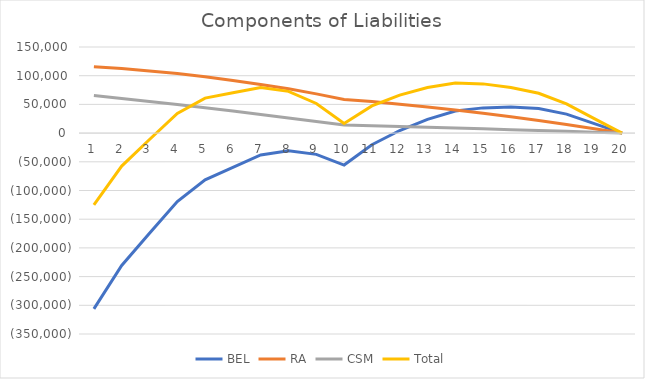
| Category | BEL | RA | CSM | Total |
|---|---|---|---|---|
| 0 | -306260.478 | 115637.247 | 65696.036 | -124927.195 |
| 1 | -230634.913 | 112665.937 | 60455.603 | -57513.374 |
| 2 | -174448.079 | 108155.173 | 55103.244 | -11189.661 |
| 3 | -119317.088 | 103919.357 | 49634.08 | 34236.348 |
| 4 | -81376.64 | 98320.562 | 44042.218 | 60986.141 |
| 5 | -59516.419 | 91447.792 | 38322.337 | 70253.709 |
| 6 | -38055.135 | 84847.954 | 32468.886 | 79261.704 |
| 7 | -30855.16 | 77113.093 | 26475.31 | 72733.243 |
| 8 | -37014.569 | 68313.75 | 20335.566 | 51634.747 |
| 9 | -55701.859 | 58514.102 | 14043.356 | 16855.599 |
| 10 | -20168.555 | 54847.67 | 12765.016 | 47444.131 |
| 11 | 4470.627 | 50311.025 | 11461.306 | 66242.959 |
| 12 | 23858.489 | 45454.084 | 10131.513 | 79444.086 |
| 13 | 38365.006 | 40298.229 | 8774.543 | 87437.778 |
| 14 | 43929.253 | 34422.213 | 7389.253 | 85740.719 |
| 15 | 45331.264 | 28290.697 | 5974.758 | 79596.718 |
| 16 | 42858.602 | 21918.029 | 4529.806 | 69306.437 |
| 17 | 33037.55 | 14942.818 | 3053.086 | 51033.453 |
| 18 | 16366.17 | 7402.386 | 1543.529 | 25312.084 |
| 19 | 0 | 0 | 0 | 0 |